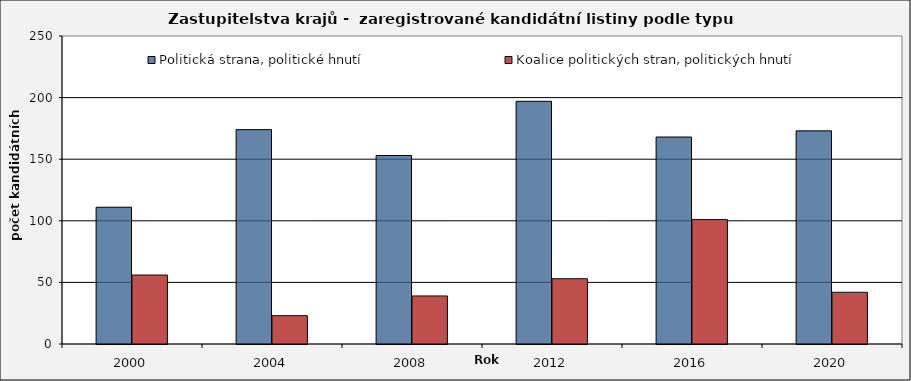
| Category | Politická strana, politické hnutí  | Koalice politických stran, politických hnutí |
|---|---|---|
| 2000.0 | 111 | 56 |
| 2004.0 | 174 | 23 |
| 2008.0 | 153 | 39 |
| 2012.0 | 197 | 53 |
| 2016.0 | 168 | 101 |
| 2020.0 | 173 | 42 |